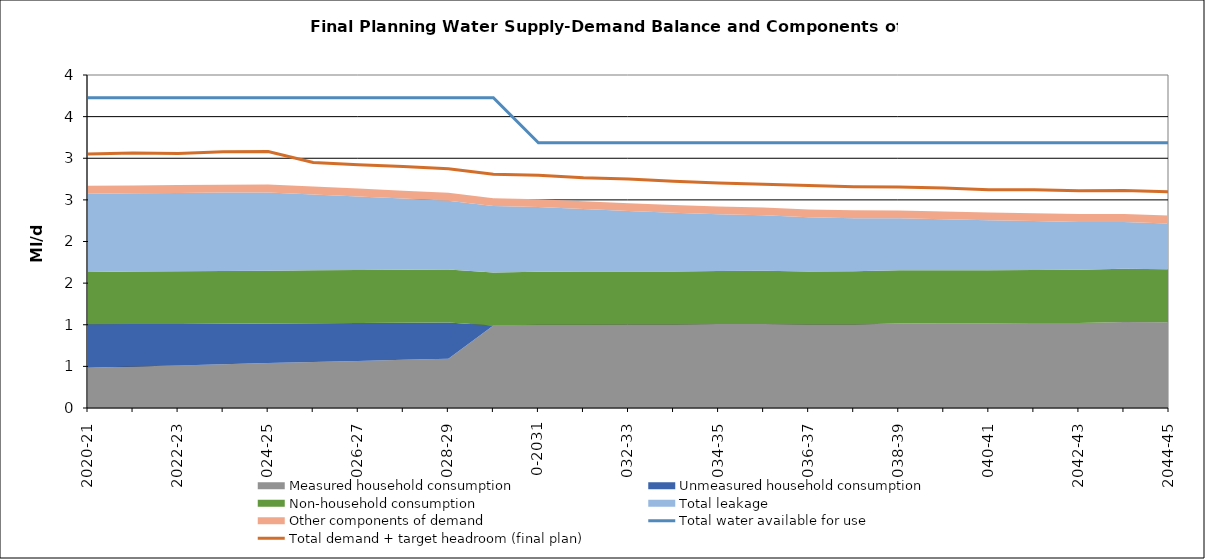
| Category | Total water available for use | Total demand + target headroom (final plan) |
|---|---|---|
| 0 | 3.726 | 3.05 |
| 1 | 3.726 | 3.063 |
| 2 | 3.726 | 3.058 |
| 3 | 3.726 | 3.078 |
| 4 | 3.726 | 3.081 |
| 5 | 3.726 | 2.95 |
| 6 | 3.726 | 2.923 |
| 7 | 3.726 | 2.9 |
| 8 | 3.726 | 2.874 |
| 9 | 3.726 | 2.807 |
| 10 | 3.186 | 2.795 |
| 11 | 3.186 | 2.765 |
| 12 | 3.186 | 2.75 |
| 13 | 3.186 | 2.723 |
| 14 | 3.186 | 2.703 |
| 15 | 3.186 | 2.688 |
| 16 | 3.186 | 2.673 |
| 17 | 3.186 | 2.659 |
| 18 | 3.186 | 2.655 |
| 19 | 3.186 | 2.642 |
| 20 | 3.186 | 2.62 |
| 21 | 3.186 | 2.621 |
| 22 | 3.186 | 2.611 |
| 23 | 3.186 | 2.613 |
| 24 | 3.186 | 2.597 |